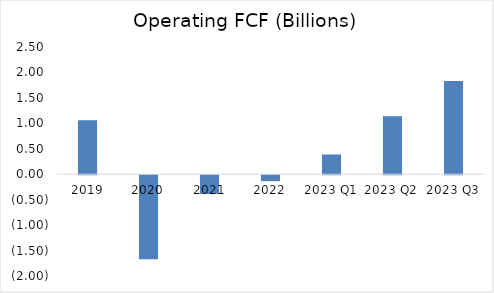
| Category | Series 0 |
|---|---|
| 2019 | 1.061 |
| 2020 | -1.652 |
| 2021 | -0.368 |
| 2022 | -0.117 |
| 2023 Q1 | 0.388 |
| 2023 Q2 | 1.137 |
| 2023 Q3 | 1.834 |